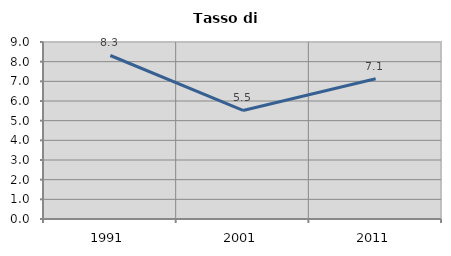
| Category | Tasso di disoccupazione   |
|---|---|
| 1991.0 | 8.314 |
| 2001.0 | 5.519 |
| 2011.0 | 7.13 |